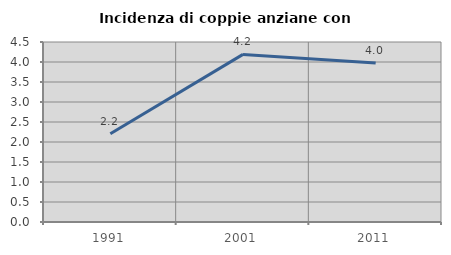
| Category | Incidenza di coppie anziane con figli |
|---|---|
| 1991.0 | 2.206 |
| 2001.0 | 4.19 |
| 2011.0 | 3.974 |